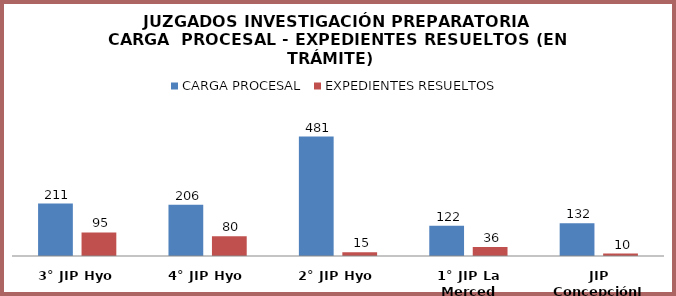
| Category | CARGA PROCESAL | EXPEDIENTES RESUELTOS |
|---|---|---|
| 3° JIP Hyo | 211 | 95 |
| 4° JIP Hyo | 206 | 80 |
| 2° JIP Hyo | 481 | 15 |
| 1° JIP La Merced | 122 | 36 |
| JIP ConcepciónI | 132 | 10 |